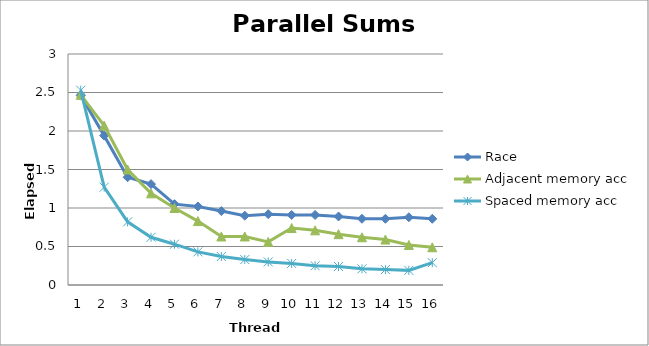
| Category | Race | Adjacent memory acc | Spaced memory acc |
|---|---|---|---|
| 0 | 2.46 | 2.47 | 2.53 |
| 1 | 1.94 | 2.07 | 1.27 |
| 2 | 1.4 | 1.5 | 0.82 |
| 3 | 1.31 | 1.19 | 0.62 |
| 4 | 1.05 | 1 | 0.53 |
| 5 | 1.02 | 0.83 | 0.43 |
| 6 | 0.96 | 0.63 | 0.37 |
| 7 | 0.9 | 0.63 | 0.33 |
| 8 | 0.92 | 0.56 | 0.3 |
| 9 | 0.91 | 0.74 | 0.28 |
| 10 | 0.91 | 0.71 | 0.25 |
| 11 | 0.89 | 0.66 | 0.24 |
| 12 | 0.86 | 0.62 | 0.21 |
| 13 | 0.86 | 0.59 | 0.2 |
| 14 | 0.88 | 0.52 | 0.19 |
| 15 | 0.86 | 0.49 | 0.29 |